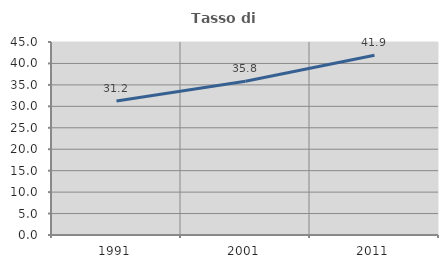
| Category | Tasso di occupazione   |
|---|---|
| 1991.0 | 31.23 |
| 2001.0 | 35.846 |
| 2011.0 | 41.928 |